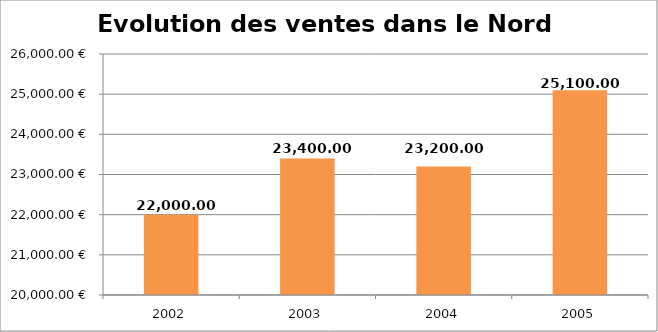
| Category | Nord Est |
|---|---|
| 2002.0 | 22000 |
| 2003.0 | 23400 |
| 2004.0 | 23200 |
| 2005.0 | 25100 |